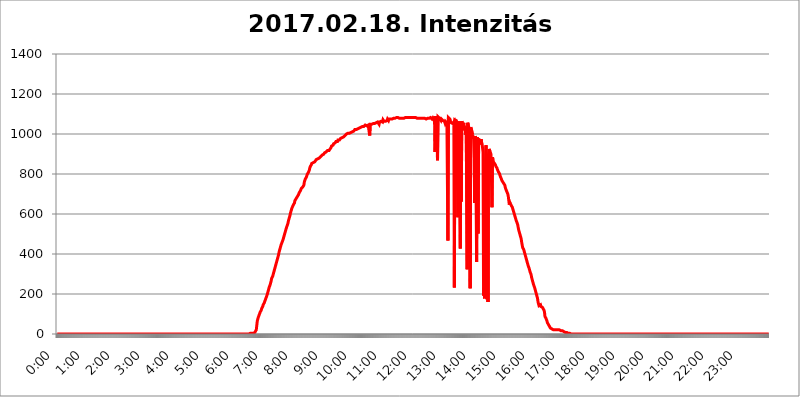
| Category | 2017.02.18. Intenzitás [W/m^2] |
|---|---|
| 0.0 | 0 |
| 0.0006944444444444445 | 0 |
| 0.001388888888888889 | 0 |
| 0.0020833333333333333 | 0 |
| 0.002777777777777778 | 0 |
| 0.003472222222222222 | 0 |
| 0.004166666666666667 | 0 |
| 0.004861111111111111 | 0 |
| 0.005555555555555556 | 0 |
| 0.0062499999999999995 | 0 |
| 0.006944444444444444 | 0 |
| 0.007638888888888889 | 0 |
| 0.008333333333333333 | 0 |
| 0.009027777777777779 | 0 |
| 0.009722222222222222 | 0 |
| 0.010416666666666666 | 0 |
| 0.011111111111111112 | 0 |
| 0.011805555555555555 | 0 |
| 0.012499999999999999 | 0 |
| 0.013194444444444444 | 0 |
| 0.013888888888888888 | 0 |
| 0.014583333333333332 | 0 |
| 0.015277777777777777 | 0 |
| 0.015972222222222224 | 0 |
| 0.016666666666666666 | 0 |
| 0.017361111111111112 | 0 |
| 0.018055555555555557 | 0 |
| 0.01875 | 0 |
| 0.019444444444444445 | 0 |
| 0.02013888888888889 | 0 |
| 0.020833333333333332 | 0 |
| 0.02152777777777778 | 0 |
| 0.022222222222222223 | 0 |
| 0.02291666666666667 | 0 |
| 0.02361111111111111 | 0 |
| 0.024305555555555556 | 0 |
| 0.024999999999999998 | 0 |
| 0.025694444444444447 | 0 |
| 0.02638888888888889 | 0 |
| 0.027083333333333334 | 0 |
| 0.027777777777777776 | 0 |
| 0.02847222222222222 | 0 |
| 0.029166666666666664 | 0 |
| 0.029861111111111113 | 0 |
| 0.030555555555555555 | 0 |
| 0.03125 | 0 |
| 0.03194444444444445 | 0 |
| 0.03263888888888889 | 0 |
| 0.03333333333333333 | 0 |
| 0.034027777777777775 | 0 |
| 0.034722222222222224 | 0 |
| 0.035416666666666666 | 0 |
| 0.036111111111111115 | 0 |
| 0.03680555555555556 | 0 |
| 0.0375 | 0 |
| 0.03819444444444444 | 0 |
| 0.03888888888888889 | 0 |
| 0.03958333333333333 | 0 |
| 0.04027777777777778 | 0 |
| 0.04097222222222222 | 0 |
| 0.041666666666666664 | 0 |
| 0.042361111111111106 | 0 |
| 0.04305555555555556 | 0 |
| 0.043750000000000004 | 0 |
| 0.044444444444444446 | 0 |
| 0.04513888888888889 | 0 |
| 0.04583333333333334 | 0 |
| 0.04652777777777778 | 0 |
| 0.04722222222222222 | 0 |
| 0.04791666666666666 | 0 |
| 0.04861111111111111 | 0 |
| 0.049305555555555554 | 0 |
| 0.049999999999999996 | 0 |
| 0.05069444444444445 | 0 |
| 0.051388888888888894 | 0 |
| 0.052083333333333336 | 0 |
| 0.05277777777777778 | 0 |
| 0.05347222222222222 | 0 |
| 0.05416666666666667 | 0 |
| 0.05486111111111111 | 0 |
| 0.05555555555555555 | 0 |
| 0.05625 | 0 |
| 0.05694444444444444 | 0 |
| 0.057638888888888885 | 0 |
| 0.05833333333333333 | 0 |
| 0.05902777777777778 | 0 |
| 0.059722222222222225 | 0 |
| 0.06041666666666667 | 0 |
| 0.061111111111111116 | 0 |
| 0.06180555555555556 | 0 |
| 0.0625 | 0 |
| 0.06319444444444444 | 0 |
| 0.06388888888888888 | 0 |
| 0.06458333333333334 | 0 |
| 0.06527777777777778 | 0 |
| 0.06597222222222222 | 0 |
| 0.06666666666666667 | 0 |
| 0.06736111111111111 | 0 |
| 0.06805555555555555 | 0 |
| 0.06874999999999999 | 0 |
| 0.06944444444444443 | 0 |
| 0.07013888888888889 | 0 |
| 0.07083333333333333 | 0 |
| 0.07152777777777779 | 0 |
| 0.07222222222222223 | 0 |
| 0.07291666666666667 | 0 |
| 0.07361111111111111 | 0 |
| 0.07430555555555556 | 0 |
| 0.075 | 0 |
| 0.07569444444444444 | 0 |
| 0.0763888888888889 | 0 |
| 0.07708333333333334 | 0 |
| 0.07777777777777778 | 0 |
| 0.07847222222222222 | 0 |
| 0.07916666666666666 | 0 |
| 0.0798611111111111 | 0 |
| 0.08055555555555556 | 0 |
| 0.08125 | 0 |
| 0.08194444444444444 | 0 |
| 0.08263888888888889 | 0 |
| 0.08333333333333333 | 0 |
| 0.08402777777777777 | 0 |
| 0.08472222222222221 | 0 |
| 0.08541666666666665 | 0 |
| 0.08611111111111112 | 0 |
| 0.08680555555555557 | 0 |
| 0.08750000000000001 | 0 |
| 0.08819444444444445 | 0 |
| 0.08888888888888889 | 0 |
| 0.08958333333333333 | 0 |
| 0.09027777777777778 | 0 |
| 0.09097222222222222 | 0 |
| 0.09166666666666667 | 0 |
| 0.09236111111111112 | 0 |
| 0.09305555555555556 | 0 |
| 0.09375 | 0 |
| 0.09444444444444444 | 0 |
| 0.09513888888888888 | 0 |
| 0.09583333333333333 | 0 |
| 0.09652777777777777 | 0 |
| 0.09722222222222222 | 0 |
| 0.09791666666666667 | 0 |
| 0.09861111111111111 | 0 |
| 0.09930555555555555 | 0 |
| 0.09999999999999999 | 0 |
| 0.10069444444444443 | 0 |
| 0.1013888888888889 | 0 |
| 0.10208333333333335 | 0 |
| 0.10277777777777779 | 0 |
| 0.10347222222222223 | 0 |
| 0.10416666666666667 | 0 |
| 0.10486111111111111 | 0 |
| 0.10555555555555556 | 0 |
| 0.10625 | 0 |
| 0.10694444444444444 | 0 |
| 0.1076388888888889 | 0 |
| 0.10833333333333334 | 0 |
| 0.10902777777777778 | 0 |
| 0.10972222222222222 | 0 |
| 0.1111111111111111 | 0 |
| 0.11180555555555556 | 0 |
| 0.11180555555555556 | 0 |
| 0.1125 | 0 |
| 0.11319444444444444 | 0 |
| 0.11388888888888889 | 0 |
| 0.11458333333333333 | 0 |
| 0.11527777777777777 | 0 |
| 0.11597222222222221 | 0 |
| 0.11666666666666665 | 0 |
| 0.1173611111111111 | 0 |
| 0.11805555555555557 | 0 |
| 0.11944444444444445 | 0 |
| 0.12013888888888889 | 0 |
| 0.12083333333333333 | 0 |
| 0.12152777777777778 | 0 |
| 0.12222222222222223 | 0 |
| 0.12291666666666667 | 0 |
| 0.12291666666666667 | 0 |
| 0.12361111111111112 | 0 |
| 0.12430555555555556 | 0 |
| 0.125 | 0 |
| 0.12569444444444444 | 0 |
| 0.12638888888888888 | 0 |
| 0.12708333333333333 | 0 |
| 0.16875 | 0 |
| 0.12847222222222224 | 0 |
| 0.12916666666666668 | 0 |
| 0.12986111111111112 | 0 |
| 0.13055555555555556 | 0 |
| 0.13125 | 0 |
| 0.13194444444444445 | 0 |
| 0.1326388888888889 | 0 |
| 0.13333333333333333 | 0 |
| 0.13402777777777777 | 0 |
| 0.13402777777777777 | 0 |
| 0.13472222222222222 | 0 |
| 0.13541666666666666 | 0 |
| 0.1361111111111111 | 0 |
| 0.13749999999999998 | 0 |
| 0.13819444444444443 | 0 |
| 0.1388888888888889 | 0 |
| 0.13958333333333334 | 0 |
| 0.14027777777777778 | 0 |
| 0.14097222222222222 | 0 |
| 0.14166666666666666 | 0 |
| 0.1423611111111111 | 0 |
| 0.14305555555555557 | 0 |
| 0.14375000000000002 | 0 |
| 0.14444444444444446 | 0 |
| 0.1451388888888889 | 0 |
| 0.1451388888888889 | 0 |
| 0.14652777777777778 | 0 |
| 0.14722222222222223 | 0 |
| 0.14791666666666667 | 0 |
| 0.1486111111111111 | 0 |
| 0.14930555555555555 | 0 |
| 0.15 | 0 |
| 0.15069444444444444 | 0 |
| 0.15138888888888888 | 0 |
| 0.15208333333333332 | 0 |
| 0.15277777777777776 | 0 |
| 0.15347222222222223 | 0 |
| 0.15416666666666667 | 0 |
| 0.15486111111111112 | 0 |
| 0.15555555555555556 | 0 |
| 0.15625 | 0 |
| 0.15694444444444444 | 0 |
| 0.15763888888888888 | 0 |
| 0.15833333333333333 | 0 |
| 0.15902777777777777 | 0 |
| 0.15972222222222224 | 0 |
| 0.16041666666666668 | 0 |
| 0.16111111111111112 | 0 |
| 0.16180555555555556 | 0 |
| 0.1625 | 0 |
| 0.16319444444444445 | 0 |
| 0.1638888888888889 | 0 |
| 0.16458333333333333 | 0 |
| 0.16527777777777777 | 0 |
| 0.16597222222222222 | 0 |
| 0.16666666666666666 | 0 |
| 0.1673611111111111 | 0 |
| 0.16805555555555554 | 0 |
| 0.16874999999999998 | 0 |
| 0.16944444444444443 | 0 |
| 0.17013888888888887 | 0 |
| 0.1708333333333333 | 0 |
| 0.17152777777777775 | 0 |
| 0.17222222222222225 | 0 |
| 0.1729166666666667 | 0 |
| 0.17361111111111113 | 0 |
| 0.17430555555555557 | 0 |
| 0.17500000000000002 | 0 |
| 0.17569444444444446 | 0 |
| 0.1763888888888889 | 0 |
| 0.17708333333333334 | 0 |
| 0.17777777777777778 | 0 |
| 0.17847222222222223 | 0 |
| 0.17916666666666667 | 0 |
| 0.1798611111111111 | 0 |
| 0.18055555555555555 | 0 |
| 0.18125 | 0 |
| 0.18194444444444444 | 0 |
| 0.1826388888888889 | 0 |
| 0.18333333333333335 | 0 |
| 0.1840277777777778 | 0 |
| 0.18472222222222223 | 0 |
| 0.18541666666666667 | 0 |
| 0.18611111111111112 | 0 |
| 0.18680555555555556 | 0 |
| 0.1875 | 0 |
| 0.18819444444444444 | 0 |
| 0.18888888888888888 | 0 |
| 0.18958333333333333 | 0 |
| 0.19027777777777777 | 0 |
| 0.1909722222222222 | 0 |
| 0.19166666666666665 | 0 |
| 0.19236111111111112 | 0 |
| 0.19305555555555554 | 0 |
| 0.19375 | 0 |
| 0.19444444444444445 | 0 |
| 0.1951388888888889 | 0 |
| 0.19583333333333333 | 0 |
| 0.19652777777777777 | 0 |
| 0.19722222222222222 | 0 |
| 0.19791666666666666 | 0 |
| 0.1986111111111111 | 0 |
| 0.19930555555555554 | 0 |
| 0.19999999999999998 | 0 |
| 0.20069444444444443 | 0 |
| 0.20138888888888887 | 0 |
| 0.2020833333333333 | 0 |
| 0.2027777777777778 | 0 |
| 0.2034722222222222 | 0 |
| 0.2041666666666667 | 0 |
| 0.20486111111111113 | 0 |
| 0.20555555555555557 | 0 |
| 0.20625000000000002 | 0 |
| 0.20694444444444446 | 0 |
| 0.2076388888888889 | 0 |
| 0.20833333333333334 | 0 |
| 0.20902777777777778 | 0 |
| 0.20972222222222223 | 0 |
| 0.21041666666666667 | 0 |
| 0.2111111111111111 | 0 |
| 0.21180555555555555 | 0 |
| 0.2125 | 0 |
| 0.21319444444444444 | 0 |
| 0.2138888888888889 | 0 |
| 0.21458333333333335 | 0 |
| 0.2152777777777778 | 0 |
| 0.21597222222222223 | 0 |
| 0.21666666666666667 | 0 |
| 0.21736111111111112 | 0 |
| 0.21805555555555556 | 0 |
| 0.21875 | 0 |
| 0.21944444444444444 | 0 |
| 0.22013888888888888 | 0 |
| 0.22083333333333333 | 0 |
| 0.22152777777777777 | 0 |
| 0.2222222222222222 | 0 |
| 0.22291666666666665 | 0 |
| 0.2236111111111111 | 0 |
| 0.22430555555555556 | 0 |
| 0.225 | 0 |
| 0.22569444444444445 | 0 |
| 0.2263888888888889 | 0 |
| 0.22708333333333333 | 0 |
| 0.22777777777777777 | 0 |
| 0.22847222222222222 | 0 |
| 0.22916666666666666 | 0 |
| 0.2298611111111111 | 0 |
| 0.23055555555555554 | 0 |
| 0.23124999999999998 | 0 |
| 0.23194444444444443 | 0 |
| 0.23263888888888887 | 0 |
| 0.2333333333333333 | 0 |
| 0.2340277777777778 | 0 |
| 0.2347222222222222 | 0 |
| 0.2354166666666667 | 0 |
| 0.23611111111111113 | 0 |
| 0.23680555555555557 | 0 |
| 0.23750000000000002 | 0 |
| 0.23819444444444446 | 0 |
| 0.2388888888888889 | 0 |
| 0.23958333333333334 | 0 |
| 0.24027777777777778 | 0 |
| 0.24097222222222223 | 0 |
| 0.24166666666666667 | 0 |
| 0.2423611111111111 | 0 |
| 0.24305555555555555 | 0 |
| 0.24375 | 0 |
| 0.24444444444444446 | 0 |
| 0.24513888888888888 | 0 |
| 0.24583333333333335 | 0 |
| 0.2465277777777778 | 0 |
| 0.24722222222222223 | 0 |
| 0.24791666666666667 | 0 |
| 0.24861111111111112 | 0 |
| 0.24930555555555556 | 0 |
| 0.25 | 0 |
| 0.25069444444444444 | 0 |
| 0.2513888888888889 | 0 |
| 0.2520833333333333 | 0 |
| 0.25277777777777777 | 0 |
| 0.2534722222222222 | 0 |
| 0.25416666666666665 | 0 |
| 0.2548611111111111 | 0 |
| 0.2555555555555556 | 0 |
| 0.25625000000000003 | 0 |
| 0.2569444444444445 | 0 |
| 0.2576388888888889 | 0 |
| 0.25833333333333336 | 0 |
| 0.2590277777777778 | 0 |
| 0.25972222222222224 | 0 |
| 0.2604166666666667 | 0 |
| 0.2611111111111111 | 0 |
| 0.26180555555555557 | 0 |
| 0.2625 | 0 |
| 0.26319444444444445 | 0 |
| 0.2638888888888889 | 0 |
| 0.26458333333333334 | 0 |
| 0.2652777777777778 | 0 |
| 0.2659722222222222 | 0 |
| 0.26666666666666666 | 0 |
| 0.2673611111111111 | 0 |
| 0.26805555555555555 | 0 |
| 0.26875 | 0 |
| 0.26944444444444443 | 3.525 |
| 0.2701388888888889 | 3.525 |
| 0.2708333333333333 | 3.525 |
| 0.27152777777777776 | 3.525 |
| 0.2722222222222222 | 3.525 |
| 0.27291666666666664 | 3.525 |
| 0.2736111111111111 | 3.525 |
| 0.2743055555555555 | 3.525 |
| 0.27499999999999997 | 3.525 |
| 0.27569444444444446 | 7.887 |
| 0.27638888888888885 | 7.887 |
| 0.27708333333333335 | 7.887 |
| 0.2777777777777778 | 12.257 |
| 0.27847222222222223 | 12.257 |
| 0.2791666666666667 | 21.024 |
| 0.2798611111111111 | 43.079 |
| 0.28055555555555556 | 65.31 |
| 0.28125 | 74.246 |
| 0.28194444444444444 | 83.205 |
| 0.2826388888888889 | 87.692 |
| 0.2833333333333333 | 96.682 |
| 0.28402777777777777 | 101.184 |
| 0.2847222222222222 | 110.201 |
| 0.28541666666666665 | 114.716 |
| 0.28611111111111115 | 119.235 |
| 0.28680555555555554 | 128.284 |
| 0.28750000000000003 | 132.814 |
| 0.2881944444444445 | 137.347 |
| 0.2888888888888889 | 146.423 |
| 0.28958333333333336 | 150.964 |
| 0.2902777777777778 | 155.509 |
| 0.29097222222222224 | 160.056 |
| 0.2916666666666667 | 169.156 |
| 0.2923611111111111 | 173.709 |
| 0.29305555555555557 | 182.82 |
| 0.29375 | 187.378 |
| 0.29444444444444445 | 196.497 |
| 0.2951388888888889 | 205.62 |
| 0.29583333333333334 | 214.746 |
| 0.2965277777777778 | 223.873 |
| 0.2972222222222222 | 233 |
| 0.29791666666666666 | 237.564 |
| 0.2986111111111111 | 246.689 |
| 0.29930555555555555 | 255.813 |
| 0.3 | 264.932 |
| 0.30069444444444443 | 278.603 |
| 0.3013888888888889 | 283.156 |
| 0.3020833333333333 | 287.709 |
| 0.30277777777777776 | 296.808 |
| 0.3034722222222222 | 305.898 |
| 0.30416666666666664 | 314.98 |
| 0.3048611111111111 | 319.517 |
| 0.3055555555555555 | 333.113 |
| 0.30624999999999997 | 342.162 |
| 0.3069444444444444 | 351.198 |
| 0.3076388888888889 | 360.221 |
| 0.30833333333333335 | 360.221 |
| 0.3090277777777778 | 378.224 |
| 0.30972222222222223 | 387.202 |
| 0.3104166666666667 | 396.164 |
| 0.3111111111111111 | 409.574 |
| 0.31180555555555556 | 418.492 |
| 0.3125 | 427.39 |
| 0.31319444444444444 | 436.27 |
| 0.3138888888888889 | 445.129 |
| 0.3145833333333333 | 449.551 |
| 0.31527777777777777 | 458.38 |
| 0.3159722222222222 | 462.786 |
| 0.31666666666666665 | 471.582 |
| 0.31736111111111115 | 480.356 |
| 0.31805555555555554 | 489.108 |
| 0.31875000000000003 | 497.836 |
| 0.3194444444444445 | 506.542 |
| 0.3201388888888889 | 515.223 |
| 0.32083333333333336 | 523.88 |
| 0.3215277777777778 | 532.513 |
| 0.32222222222222224 | 536.82 |
| 0.3229166666666667 | 536.82 |
| 0.3236111111111111 | 553.986 |
| 0.32430555555555557 | 566.793 |
| 0.325 | 575.299 |
| 0.32569444444444445 | 583.779 |
| 0.3263888888888889 | 592.233 |
| 0.32708333333333334 | 604.864 |
| 0.3277777777777778 | 613.252 |
| 0.3284722222222222 | 621.613 |
| 0.32916666666666666 | 629.948 |
| 0.3298611111111111 | 634.105 |
| 0.33055555555555555 | 634.105 |
| 0.33125 | 646.537 |
| 0.33194444444444443 | 650.667 |
| 0.3326388888888889 | 654.791 |
| 0.3333333333333333 | 667.123 |
| 0.3340277777777778 | 671.22 |
| 0.3347222222222222 | 671.22 |
| 0.3354166666666667 | 679.395 |
| 0.3361111111111111 | 683.473 |
| 0.3368055555555556 | 687.544 |
| 0.33749999999999997 | 687.544 |
| 0.33819444444444446 | 695.666 |
| 0.33888888888888885 | 695.666 |
| 0.33958333333333335 | 707.8 |
| 0.34027777777777773 | 711.832 |
| 0.34097222222222223 | 715.858 |
| 0.3416666666666666 | 719.877 |
| 0.3423611111111111 | 727.896 |
| 0.3430555555555555 | 727.896 |
| 0.34375 | 731.896 |
| 0.3444444444444445 | 735.89 |
| 0.3451388888888889 | 739.877 |
| 0.3458333333333334 | 743.859 |
| 0.34652777777777777 | 759.723 |
| 0.34722222222222227 | 759.723 |
| 0.34791666666666665 | 775.492 |
| 0.34861111111111115 | 779.42 |
| 0.34930555555555554 | 783.342 |
| 0.35000000000000003 | 791.169 |
| 0.3506944444444444 | 798.974 |
| 0.3513888888888889 | 802.868 |
| 0.3520833333333333 | 806.757 |
| 0.3527777777777778 | 810.641 |
| 0.3534722222222222 | 818.392 |
| 0.3541666666666667 | 829.981 |
| 0.3548611111111111 | 837.682 |
| 0.35555555555555557 | 841.526 |
| 0.35625 | 845.365 |
| 0.35694444444444445 | 853.029 |
| 0.3576388888888889 | 849.199 |
| 0.35833333333333334 | 853.029 |
| 0.3590277777777778 | 856.855 |
| 0.3597222222222222 | 860.676 |
| 0.36041666666666666 | 860.676 |
| 0.3611111111111111 | 860.676 |
| 0.36180555555555555 | 860.676 |
| 0.3625 | 860.676 |
| 0.36319444444444443 | 872.114 |
| 0.3638888888888889 | 872.114 |
| 0.3645833333333333 | 872.114 |
| 0.3652777777777778 | 875.918 |
| 0.3659722222222222 | 875.918 |
| 0.3666666666666667 | 875.918 |
| 0.3673611111111111 | 879.719 |
| 0.3680555555555556 | 883.516 |
| 0.36874999999999997 | 883.516 |
| 0.36944444444444446 | 887.309 |
| 0.37013888888888885 | 887.309 |
| 0.37083333333333335 | 891.099 |
| 0.37152777777777773 | 894.885 |
| 0.37222222222222223 | 898.668 |
| 0.3729166666666666 | 894.885 |
| 0.3736111111111111 | 898.668 |
| 0.3743055555555555 | 902.447 |
| 0.375 | 906.223 |
| 0.3756944444444445 | 906.223 |
| 0.3763888888888889 | 909.996 |
| 0.3770833333333334 | 909.996 |
| 0.37777777777777777 | 909.996 |
| 0.37847222222222227 | 909.996 |
| 0.37916666666666665 | 917.534 |
| 0.37986111111111115 | 917.534 |
| 0.38055555555555554 | 917.534 |
| 0.38125000000000003 | 917.534 |
| 0.3819444444444444 | 921.298 |
| 0.3826388888888889 | 925.06 |
| 0.3833333333333333 | 928.819 |
| 0.3840277777777778 | 932.576 |
| 0.3847222222222222 | 940.082 |
| 0.3854166666666667 | 940.082 |
| 0.3861111111111111 | 943.832 |
| 0.38680555555555557 | 943.832 |
| 0.3875 | 951.327 |
| 0.38819444444444445 | 955.071 |
| 0.3888888888888889 | 955.071 |
| 0.38958333333333334 | 955.071 |
| 0.3902777777777778 | 955.071 |
| 0.3909722222222222 | 962.555 |
| 0.39166666666666666 | 962.555 |
| 0.3923611111111111 | 958.814 |
| 0.39305555555555555 | 962.555 |
| 0.39375 | 970.034 |
| 0.39444444444444443 | 970.034 |
| 0.3951388888888889 | 970.034 |
| 0.3958333333333333 | 970.034 |
| 0.3965277777777778 | 973.772 |
| 0.3972222222222222 | 977.508 |
| 0.3979166666666667 | 977.508 |
| 0.3986111111111111 | 977.508 |
| 0.3993055555555556 | 981.244 |
| 0.39999999999999997 | 984.98 |
| 0.40069444444444446 | 984.98 |
| 0.40138888888888885 | 984.98 |
| 0.40208333333333335 | 988.714 |
| 0.40277777777777773 | 988.714 |
| 0.40347222222222223 | 992.448 |
| 0.4041666666666666 | 992.448 |
| 0.4048611111111111 | 996.182 |
| 0.4055555555555555 | 999.916 |
| 0.40625 | 996.182 |
| 0.4069444444444445 | 999.916 |
| 0.4076388888888889 | 1003.65 |
| 0.4083333333333334 | 1003.65 |
| 0.40902777777777777 | 999.916 |
| 0.40972222222222227 | 1003.65 |
| 0.41041666666666665 | 1007.383 |
| 0.41111111111111115 | 1007.383 |
| 0.41180555555555554 | 1007.383 |
| 0.41250000000000003 | 1007.383 |
| 0.4131944444444444 | 1011.118 |
| 0.4138888888888889 | 1011.118 |
| 0.4145833333333333 | 1014.852 |
| 0.4152777777777778 | 1014.852 |
| 0.4159722222222222 | 1014.852 |
| 0.4166666666666667 | 1018.587 |
| 0.4173611111111111 | 1022.323 |
| 0.41805555555555557 | 1022.323 |
| 0.41875 | 1022.323 |
| 0.41944444444444445 | 1022.323 |
| 0.4201388888888889 | 1026.06 |
| 0.42083333333333334 | 1026.06 |
| 0.4215277777777778 | 1026.06 |
| 0.4222222222222222 | 1029.798 |
| 0.42291666666666666 | 1029.798 |
| 0.4236111111111111 | 1029.798 |
| 0.42430555555555555 | 1033.537 |
| 0.425 | 1033.537 |
| 0.42569444444444443 | 1033.537 |
| 0.4263888888888889 | 1037.277 |
| 0.4270833333333333 | 1037.277 |
| 0.4277777777777778 | 1037.277 |
| 0.4284722222222222 | 1037.277 |
| 0.4291666666666667 | 1037.277 |
| 0.4298611111111111 | 1037.277 |
| 0.4305555555555556 | 1037.277 |
| 0.43124999999999997 | 1041.019 |
| 0.43194444444444446 | 1044.762 |
| 0.43263888888888885 | 1041.019 |
| 0.43333333333333335 | 1044.762 |
| 0.43402777777777773 | 1041.019 |
| 0.43472222222222223 | 1041.019 |
| 0.4354166666666666 | 1044.762 |
| 0.4361111111111111 | 1044.762 |
| 0.4368055555555555 | 1048.508 |
| 0.4375 | 1044.762 |
| 0.4381944444444445 | 992.448 |
| 0.4388888888888889 | 1048.508 |
| 0.4395833333333334 | 1048.508 |
| 0.44027777777777777 | 1052.255 |
| 0.44097222222222227 | 1048.508 |
| 0.44166666666666665 | 1052.255 |
| 0.44236111111111115 | 1052.255 |
| 0.44305555555555554 | 1052.255 |
| 0.44375000000000003 | 1052.255 |
| 0.4444444444444444 | 1056.004 |
| 0.4451388888888889 | 1052.255 |
| 0.4458333333333333 | 1056.004 |
| 0.4465277777777778 | 1056.004 |
| 0.4472222222222222 | 1056.004 |
| 0.4479166666666667 | 1059.756 |
| 0.4486111111111111 | 1059.756 |
| 0.44930555555555557 | 1059.756 |
| 0.45 | 1063.51 |
| 0.45069444444444445 | 1063.51 |
| 0.4513888888888889 | 1048.508 |
| 0.45208333333333334 | 1059.756 |
| 0.4527777777777778 | 1063.51 |
| 0.4534722222222222 | 1063.51 |
| 0.45416666666666666 | 1063.51 |
| 0.4548611111111111 | 1067.267 |
| 0.45555555555555555 | 1067.267 |
| 0.45625 | 1059.756 |
| 0.45694444444444443 | 1071.027 |
| 0.4576388888888889 | 1067.267 |
| 0.4583333333333333 | 1063.51 |
| 0.4590277777777778 | 1067.267 |
| 0.4597222222222222 | 1067.267 |
| 0.4604166666666667 | 1063.51 |
| 0.4611111111111111 | 1067.267 |
| 0.4618055555555556 | 1063.51 |
| 0.46249999999999997 | 1067.267 |
| 0.46319444444444446 | 1074.789 |
| 0.46388888888888885 | 1074.789 |
| 0.46458333333333335 | 1067.267 |
| 0.46527777777777773 | 1074.789 |
| 0.46597222222222223 | 1074.789 |
| 0.4666666666666666 | 1074.789 |
| 0.4673611111111111 | 1074.789 |
| 0.4680555555555555 | 1074.789 |
| 0.46875 | 1074.789 |
| 0.4694444444444445 | 1074.789 |
| 0.4701388888888889 | 1074.789 |
| 0.4708333333333334 | 1074.789 |
| 0.47152777777777777 | 1078.555 |
| 0.47222222222222227 | 1078.555 |
| 0.47291666666666665 | 1078.555 |
| 0.47361111111111115 | 1078.555 |
| 0.47430555555555554 | 1078.555 |
| 0.47500000000000003 | 1078.555 |
| 0.4756944444444444 | 1082.324 |
| 0.4763888888888889 | 1078.555 |
| 0.4770833333333333 | 1078.555 |
| 0.4777777777777778 | 1082.324 |
| 0.4784722222222222 | 1082.324 |
| 0.4791666666666667 | 1078.555 |
| 0.4798611111111111 | 1078.555 |
| 0.48055555555555557 | 1078.555 |
| 0.48125 | 1078.555 |
| 0.48194444444444445 | 1078.555 |
| 0.4826388888888889 | 1078.555 |
| 0.48333333333333334 | 1078.555 |
| 0.4840277777777778 | 1078.555 |
| 0.4847222222222222 | 1078.555 |
| 0.48541666666666666 | 1078.555 |
| 0.4861111111111111 | 1078.555 |
| 0.48680555555555555 | 1082.324 |
| 0.4875 | 1082.324 |
| 0.48819444444444443 | 1082.324 |
| 0.4888888888888889 | 1082.324 |
| 0.4895833333333333 | 1082.324 |
| 0.4902777777777778 | 1082.324 |
| 0.4909722222222222 | 1082.324 |
| 0.4916666666666667 | 1082.324 |
| 0.4923611111111111 | 1082.324 |
| 0.4930555555555556 | 1082.324 |
| 0.49374999999999997 | 1082.324 |
| 0.49444444444444446 | 1082.324 |
| 0.49513888888888885 | 1082.324 |
| 0.49583333333333335 | 1082.324 |
| 0.49652777777777773 | 1082.324 |
| 0.49722222222222223 | 1082.324 |
| 0.4979166666666666 | 1082.324 |
| 0.4986111111111111 | 1082.324 |
| 0.4993055555555555 | 1082.324 |
| 0.5 | 1082.324 |
| 0.5006944444444444 | 1082.324 |
| 0.5013888888888889 | 1082.324 |
| 0.5020833333333333 | 1082.324 |
| 0.5027777777777778 | 1082.324 |
| 0.5034722222222222 | 1082.324 |
| 0.5041666666666667 | 1082.324 |
| 0.5048611111111111 | 1078.555 |
| 0.5055555555555555 | 1078.555 |
| 0.50625 | 1082.324 |
| 0.5069444444444444 | 1078.555 |
| 0.5076388888888889 | 1078.555 |
| 0.5083333333333333 | 1078.555 |
| 0.5090277777777777 | 1078.555 |
| 0.5097222222222222 | 1074.789 |
| 0.5104166666666666 | 1074.789 |
| 0.5111111111111112 | 1078.555 |
| 0.5118055555555555 | 1074.789 |
| 0.5125000000000001 | 1078.555 |
| 0.5131944444444444 | 1078.555 |
| 0.513888888888889 | 1074.789 |
| 0.5145833333333333 | 1082.324 |
| 0.5152777777777778 | 1078.555 |
| 0.5159722222222222 | 1078.555 |
| 0.5166666666666667 | 1078.555 |
| 0.517361111111111 | 1074.789 |
| 0.5180555555555556 | 1074.789 |
| 0.5187499999999999 | 1074.789 |
| 0.5194444444444445 | 1078.555 |
| 0.5201388888888888 | 1074.789 |
| 0.5208333333333334 | 1074.789 |
| 0.5215277777777778 | 1078.555 |
| 0.5222222222222223 | 1082.324 |
| 0.5229166666666667 | 1082.324 |
| 0.5236111111111111 | 1082.324 |
| 0.5243055555555556 | 1078.555 |
| 0.525 | 1078.555 |
| 0.5256944444444445 | 1074.789 |
| 0.5263888888888889 | 1078.555 |
| 0.5270833333333333 | 1082.324 |
| 0.5277777777777778 | 1082.324 |
| 0.5284722222222222 | 1082.324 |
| 0.5291666666666667 | 1074.789 |
| 0.5298611111111111 | 909.996 |
| 0.5305555555555556 | 1089.873 |
| 0.53125 | 1086.097 |
| 0.5319444444444444 | 981.244 |
| 0.5326388888888889 | 1086.097 |
| 0.5333333333333333 | 868.305 |
| 0.5340277777777778 | 1086.097 |
| 0.5347222222222222 | 1086.097 |
| 0.5354166666666667 | 1086.097 |
| 0.5361111111111111 | 1078.555 |
| 0.5368055555555555 | 1078.555 |
| 0.5375 | 1074.789 |
| 0.5381944444444444 | 1067.267 |
| 0.5388888888888889 | 1074.789 |
| 0.5395833333333333 | 1074.789 |
| 0.5402777777777777 | 1071.027 |
| 0.5409722222222222 | 1067.267 |
| 0.5416666666666666 | 1067.267 |
| 0.5423611111111112 | 1067.267 |
| 0.5430555555555555 | 1063.51 |
| 0.5437500000000001 | 1056.004 |
| 0.5444444444444444 | 1063.51 |
| 0.545138888888889 | 1059.756 |
| 0.5458333333333333 | 1063.51 |
| 0.5465277777777778 | 1056.004 |
| 0.5472222222222222 | 1052.255 |
| 0.5479166666666667 | 467.187 |
| 0.548611111111111 | 1082.324 |
| 0.5493055555555556 | 1078.555 |
| 0.5499999999999999 | 1082.324 |
| 0.5506944444444445 | 1074.789 |
| 0.5513888888888888 | 1067.267 |
| 0.5520833333333334 | 1063.51 |
| 0.5527777777777778 | 1056.004 |
| 0.5534722222222223 | 1052.255 |
| 0.5541666666666667 | 1052.255 |
| 0.5548611111111111 | 1052.255 |
| 0.5555555555555556 | 1048.508 |
| 0.55625 | 1059.756 |
| 0.5569444444444445 | 233 |
| 0.5576388888888889 | 1071.027 |
| 0.5583333333333333 | 1074.789 |
| 0.5590277777777778 | 1071.027 |
| 0.5597222222222222 | 1067.267 |
| 0.5604166666666667 | 1059.756 |
| 0.5611111111111111 | 1052.255 |
| 0.5618055555555556 | 583.779 |
| 0.5625 | 1044.762 |
| 0.5631944444444444 | 1048.508 |
| 0.5638888888888889 | 1063.51 |
| 0.5645833333333333 | 621.613 |
| 0.5652777777777778 | 427.39 |
| 0.5659722222222222 | 1056.004 |
| 0.5666666666666667 | 663.019 |
| 0.5673611111111111 | 1063.51 |
| 0.5680555555555555 | 1056.004 |
| 0.56875 | 1052.255 |
| 0.5694444444444444 | 1041.019 |
| 0.5701388888888889 | 1056.004 |
| 0.5708333333333333 | 1018.587 |
| 0.5715277777777777 | 1037.277 |
| 0.5722222222222222 | 1029.798 |
| 0.5729166666666666 | 996.182 |
| 0.5736111111111112 | 1033.537 |
| 0.5743055555555555 | 1037.277 |
| 0.5750000000000001 | 324.052 |
| 0.5756944444444444 | 1056.004 |
| 0.576388888888889 | 1044.762 |
| 0.5770833333333333 | 1037.277 |
| 0.5777777777777778 | 378.224 |
| 0.5784722222222222 | 1018.587 |
| 0.5791666666666667 | 228.436 |
| 0.579861111111111 | 1033.537 |
| 0.5805555555555556 | 1029.798 |
| 0.5812499999999999 | 1018.587 |
| 0.5819444444444445 | 1011.118 |
| 0.5826388888888888 | 996.182 |
| 0.5833333333333334 | 992.448 |
| 0.5840277777777778 | 973.772 |
| 0.5847222222222223 | 891.099 |
| 0.5854166666666667 | 654.791 |
| 0.5861111111111111 | 988.714 |
| 0.5868055555555556 | 981.244 |
| 0.5875 | 984.98 |
| 0.5881944444444445 | 360.221 |
| 0.5888888888888889 | 984.98 |
| 0.5895833333333333 | 755.766 |
| 0.5902777777777778 | 502.192 |
| 0.5909722222222222 | 977.508 |
| 0.5916666666666667 | 955.071 |
| 0.5923611111111111 | 966.295 |
| 0.5930555555555556 | 955.071 |
| 0.59375 | 947.58 |
| 0.5944444444444444 | 973.772 |
| 0.5951388888888889 | 958.814 |
| 0.5958333333333333 | 951.327 |
| 0.5965277777777778 | 951.327 |
| 0.5972222222222222 | 909.996 |
| 0.5979166666666667 | 191.937 |
| 0.5986111111111111 | 233 |
| 0.5993055555555555 | 178.264 |
| 0.6 | 296.808 |
| 0.6006944444444444 | 875.918 |
| 0.6013888888888889 | 943.832 |
| 0.6020833333333333 | 462.786 |
| 0.6027777777777777 | 173.709 |
| 0.6034722222222222 | 798.974 |
| 0.6041666666666666 | 160.056 |
| 0.6048611111111112 | 898.668 |
| 0.6055555555555555 | 925.06 |
| 0.6062500000000001 | 921.298 |
| 0.6069444444444444 | 913.766 |
| 0.607638888888889 | 906.223 |
| 0.6083333333333333 | 898.668 |
| 0.6090277777777778 | 898.668 |
| 0.6097222222222222 | 634.105 |
| 0.6104166666666667 | 883.516 |
| 0.611111111111111 | 872.114 |
| 0.6118055555555556 | 860.676 |
| 0.6124999999999999 | 856.855 |
| 0.6131944444444445 | 853.029 |
| 0.6138888888888888 | 849.199 |
| 0.6145833333333334 | 845.365 |
| 0.6152777777777778 | 837.682 |
| 0.6159722222222223 | 837.682 |
| 0.6166666666666667 | 829.981 |
| 0.6173611111111111 | 822.26 |
| 0.6180555555555556 | 818.392 |
| 0.61875 | 810.641 |
| 0.6194444444444445 | 806.757 |
| 0.6201388888888889 | 802.868 |
| 0.6208333333333333 | 795.074 |
| 0.6215277777777778 | 787.258 |
| 0.6222222222222222 | 783.342 |
| 0.6229166666666667 | 775.492 |
| 0.6236111111111111 | 767.62 |
| 0.6243055555555556 | 763.674 |
| 0.625 | 759.723 |
| 0.6256944444444444 | 755.766 |
| 0.6263888888888889 | 751.803 |
| 0.6270833333333333 | 747.834 |
| 0.6277777777777778 | 743.859 |
| 0.6284722222222222 | 731.896 |
| 0.6291666666666667 | 723.889 |
| 0.6298611111111111 | 719.877 |
| 0.6305555555555555 | 711.832 |
| 0.63125 | 711.832 |
| 0.6319444444444444 | 699.717 |
| 0.6326388888888889 | 687.544 |
| 0.6333333333333333 | 667.123 |
| 0.6340277777777777 | 646.537 |
| 0.6347222222222222 | 658.909 |
| 0.6354166666666666 | 658.909 |
| 0.6361111111111112 | 658.909 |
| 0.6368055555555555 | 642.4 |
| 0.6375000000000001 | 642.4 |
| 0.6381944444444444 | 634.105 |
| 0.638888888888889 | 629.948 |
| 0.6395833333333333 | 617.436 |
| 0.6402777777777778 | 609.062 |
| 0.6409722222222222 | 604.864 |
| 0.6416666666666667 | 592.233 |
| 0.642361111111111 | 583.779 |
| 0.6430555555555556 | 575.299 |
| 0.6437499999999999 | 566.793 |
| 0.6444444444444445 | 562.53 |
| 0.6451388888888888 | 553.986 |
| 0.6458333333333334 | 545.416 |
| 0.6465277777777778 | 532.513 |
| 0.6472222222222223 | 519.555 |
| 0.6479166666666667 | 510.885 |
| 0.6486111111111111 | 502.192 |
| 0.6493055555555556 | 493.475 |
| 0.65 | 489.108 |
| 0.6506944444444445 | 475.972 |
| 0.6513888888888889 | 458.38 |
| 0.6520833333333333 | 458.38 |
| 0.6527777777777778 | 431.833 |
| 0.6534722222222222 | 436.27 |
| 0.6541666666666667 | 422.943 |
| 0.6548611111111111 | 418.492 |
| 0.6555555555555556 | 405.108 |
| 0.65625 | 396.164 |
| 0.6569444444444444 | 387.202 |
| 0.6576388888888889 | 382.715 |
| 0.6583333333333333 | 369.23 |
| 0.6590277777777778 | 360.221 |
| 0.6597222222222222 | 351.198 |
| 0.6604166666666667 | 342.162 |
| 0.6611111111111111 | 337.639 |
| 0.6618055555555555 | 328.584 |
| 0.6625 | 319.517 |
| 0.6631944444444444 | 310.44 |
| 0.6638888888888889 | 305.898 |
| 0.6645833333333333 | 296.808 |
| 0.6652777777777777 | 283.156 |
| 0.6659722222222222 | 274.047 |
| 0.6666666666666666 | 264.932 |
| 0.6673611111111111 | 255.813 |
| 0.6680555555555556 | 246.689 |
| 0.6687500000000001 | 242.127 |
| 0.6694444444444444 | 233 |
| 0.6701388888888888 | 223.873 |
| 0.6708333333333334 | 214.746 |
| 0.6715277777777778 | 205.62 |
| 0.6722222222222222 | 196.497 |
| 0.6729166666666666 | 187.378 |
| 0.6736111111111112 | 178.264 |
| 0.6743055555555556 | 160.056 |
| 0.6749999999999999 | 150.964 |
| 0.6756944444444444 | 141.884 |
| 0.6763888888888889 | 141.884 |
| 0.6770833333333334 | 141.884 |
| 0.6777777777777777 | 146.423 |
| 0.6784722222222223 | 137.347 |
| 0.6791666666666667 | 137.347 |
| 0.6798611111111111 | 132.814 |
| 0.6805555555555555 | 132.814 |
| 0.68125 | 132.814 |
| 0.6819444444444445 | 128.284 |
| 0.6826388888888889 | 119.235 |
| 0.6833333333333332 | 110.201 |
| 0.6840277777777778 | 87.692 |
| 0.6847222222222222 | 83.205 |
| 0.6854166666666667 | 78.722 |
| 0.686111111111111 | 74.246 |
| 0.6868055555555556 | 65.31 |
| 0.6875 | 56.398 |
| 0.6881944444444444 | 51.951 |
| 0.688888888888889 | 47.511 |
| 0.6895833333333333 | 43.079 |
| 0.6902777777777778 | 38.653 |
| 0.6909722222222222 | 38.653 |
| 0.6916666666666668 | 29.823 |
| 0.6923611111111111 | 29.823 |
| 0.6930555555555555 | 29.823 |
| 0.69375 | 25.419 |
| 0.6944444444444445 | 25.419 |
| 0.6951388888888889 | 25.419 |
| 0.6958333333333333 | 21.024 |
| 0.6965277777777777 | 21.024 |
| 0.6972222222222223 | 21.024 |
| 0.6979166666666666 | 21.024 |
| 0.6986111111111111 | 21.024 |
| 0.6993055555555556 | 21.024 |
| 0.7000000000000001 | 21.024 |
| 0.7006944444444444 | 21.024 |
| 0.7013888888888888 | 21.024 |
| 0.7020833333333334 | 21.024 |
| 0.7027777777777778 | 21.024 |
| 0.7034722222222222 | 21.024 |
| 0.7041666666666666 | 21.024 |
| 0.7048611111111112 | 21.024 |
| 0.7055555555555556 | 21.024 |
| 0.7062499999999999 | 16.636 |
| 0.7069444444444444 | 16.636 |
| 0.7076388888888889 | 16.636 |
| 0.7083333333333334 | 16.636 |
| 0.7090277777777777 | 12.257 |
| 0.7097222222222223 | 12.257 |
| 0.7104166666666667 | 12.257 |
| 0.7111111111111111 | 12.257 |
| 0.7118055555555555 | 12.257 |
| 0.7125 | 7.887 |
| 0.7131944444444445 | 7.887 |
| 0.7138888888888889 | 7.887 |
| 0.7145833333333332 | 7.887 |
| 0.7152777777777778 | 7.887 |
| 0.7159722222222222 | 7.887 |
| 0.7166666666666667 | 3.525 |
| 0.717361111111111 | 3.525 |
| 0.7180555555555556 | 3.525 |
| 0.71875 | 3.525 |
| 0.7194444444444444 | 3.525 |
| 0.720138888888889 | 3.525 |
| 0.7208333333333333 | 0 |
| 0.7215277777777778 | 0 |
| 0.7222222222222222 | 0 |
| 0.7229166666666668 | 0 |
| 0.7236111111111111 | 0 |
| 0.7243055555555555 | 0 |
| 0.725 | 0 |
| 0.7256944444444445 | 0 |
| 0.7263888888888889 | 0 |
| 0.7270833333333333 | 0 |
| 0.7277777777777777 | 0 |
| 0.7284722222222223 | 0 |
| 0.7291666666666666 | 0 |
| 0.7298611111111111 | 0 |
| 0.7305555555555556 | 0 |
| 0.7312500000000001 | 0 |
| 0.7319444444444444 | 0 |
| 0.7326388888888888 | 0 |
| 0.7333333333333334 | 0 |
| 0.7340277777777778 | 0 |
| 0.7347222222222222 | 0 |
| 0.7354166666666666 | 0 |
| 0.7361111111111112 | 0 |
| 0.7368055555555556 | 0 |
| 0.7374999999999999 | 0 |
| 0.7381944444444444 | 0 |
| 0.7388888888888889 | 0 |
| 0.7395833333333334 | 0 |
| 0.7402777777777777 | 0 |
| 0.7409722222222223 | 0 |
| 0.7416666666666667 | 0 |
| 0.7423611111111111 | 0 |
| 0.7430555555555555 | 0 |
| 0.74375 | 0 |
| 0.7444444444444445 | 0 |
| 0.7451388888888889 | 0 |
| 0.7458333333333332 | 0 |
| 0.7465277777777778 | 0 |
| 0.7472222222222222 | 0 |
| 0.7479166666666667 | 0 |
| 0.748611111111111 | 0 |
| 0.7493055555555556 | 0 |
| 0.75 | 0 |
| 0.7506944444444444 | 0 |
| 0.751388888888889 | 0 |
| 0.7520833333333333 | 0 |
| 0.7527777777777778 | 0 |
| 0.7534722222222222 | 0 |
| 0.7541666666666668 | 0 |
| 0.7548611111111111 | 0 |
| 0.7555555555555555 | 0 |
| 0.75625 | 0 |
| 0.7569444444444445 | 0 |
| 0.7576388888888889 | 0 |
| 0.7583333333333333 | 0 |
| 0.7590277777777777 | 0 |
| 0.7597222222222223 | 0 |
| 0.7604166666666666 | 0 |
| 0.7611111111111111 | 0 |
| 0.7618055555555556 | 0 |
| 0.7625000000000001 | 0 |
| 0.7631944444444444 | 0 |
| 0.7638888888888888 | 0 |
| 0.7645833333333334 | 0 |
| 0.7652777777777778 | 0 |
| 0.7659722222222222 | 0 |
| 0.7666666666666666 | 0 |
| 0.7673611111111112 | 0 |
| 0.7680555555555556 | 0 |
| 0.7687499999999999 | 0 |
| 0.7694444444444444 | 0 |
| 0.7701388888888889 | 0 |
| 0.7708333333333334 | 0 |
| 0.7715277777777777 | 0 |
| 0.7722222222222223 | 0 |
| 0.7729166666666667 | 0 |
| 0.7736111111111111 | 0 |
| 0.7743055555555555 | 0 |
| 0.775 | 0 |
| 0.7756944444444445 | 0 |
| 0.7763888888888889 | 0 |
| 0.7770833333333332 | 0 |
| 0.7777777777777778 | 0 |
| 0.7784722222222222 | 0 |
| 0.7791666666666667 | 0 |
| 0.779861111111111 | 0 |
| 0.7805555555555556 | 0 |
| 0.78125 | 0 |
| 0.7819444444444444 | 0 |
| 0.782638888888889 | 0 |
| 0.7833333333333333 | 0 |
| 0.7840277777777778 | 0 |
| 0.7847222222222222 | 0 |
| 0.7854166666666668 | 0 |
| 0.7861111111111111 | 0 |
| 0.7868055555555555 | 0 |
| 0.7875 | 0 |
| 0.7881944444444445 | 0 |
| 0.7888888888888889 | 0 |
| 0.7895833333333333 | 0 |
| 0.7902777777777777 | 0 |
| 0.7909722222222223 | 0 |
| 0.7916666666666666 | 0 |
| 0.7923611111111111 | 0 |
| 0.7930555555555556 | 0 |
| 0.7937500000000001 | 0 |
| 0.7944444444444444 | 0 |
| 0.7951388888888888 | 0 |
| 0.7958333333333334 | 0 |
| 0.7965277777777778 | 0 |
| 0.7972222222222222 | 0 |
| 0.7979166666666666 | 0 |
| 0.7986111111111112 | 0 |
| 0.7993055555555556 | 0 |
| 0.7999999999999999 | 0 |
| 0.8006944444444444 | 0 |
| 0.8013888888888889 | 0 |
| 0.8020833333333334 | 0 |
| 0.8027777777777777 | 0 |
| 0.8034722222222223 | 0 |
| 0.8041666666666667 | 0 |
| 0.8048611111111111 | 0 |
| 0.8055555555555555 | 0 |
| 0.80625 | 0 |
| 0.8069444444444445 | 0 |
| 0.8076388888888889 | 0 |
| 0.8083333333333332 | 0 |
| 0.8090277777777778 | 0 |
| 0.8097222222222222 | 0 |
| 0.8104166666666667 | 0 |
| 0.811111111111111 | 0 |
| 0.8118055555555556 | 0 |
| 0.8125 | 0 |
| 0.8131944444444444 | 0 |
| 0.813888888888889 | 0 |
| 0.8145833333333333 | 0 |
| 0.8152777777777778 | 0 |
| 0.8159722222222222 | 0 |
| 0.8166666666666668 | 0 |
| 0.8173611111111111 | 0 |
| 0.8180555555555555 | 0 |
| 0.81875 | 0 |
| 0.8194444444444445 | 0 |
| 0.8201388888888889 | 0 |
| 0.8208333333333333 | 0 |
| 0.8215277777777777 | 0 |
| 0.8222222222222223 | 0 |
| 0.8229166666666666 | 0 |
| 0.8236111111111111 | 0 |
| 0.8243055555555556 | 0 |
| 0.8250000000000001 | 0 |
| 0.8256944444444444 | 0 |
| 0.8263888888888888 | 0 |
| 0.8270833333333334 | 0 |
| 0.8277777777777778 | 0 |
| 0.8284722222222222 | 0 |
| 0.8291666666666666 | 0 |
| 0.8298611111111112 | 0 |
| 0.8305555555555556 | 0 |
| 0.8312499999999999 | 0 |
| 0.8319444444444444 | 0 |
| 0.8326388888888889 | 0 |
| 0.8333333333333334 | 0 |
| 0.8340277777777777 | 0 |
| 0.8347222222222223 | 0 |
| 0.8354166666666667 | 0 |
| 0.8361111111111111 | 0 |
| 0.8368055555555555 | 0 |
| 0.8375 | 0 |
| 0.8381944444444445 | 0 |
| 0.8388888888888889 | 0 |
| 0.8395833333333332 | 0 |
| 0.8402777777777778 | 0 |
| 0.8409722222222222 | 0 |
| 0.8416666666666667 | 0 |
| 0.842361111111111 | 0 |
| 0.8430555555555556 | 0 |
| 0.84375 | 0 |
| 0.8444444444444444 | 0 |
| 0.845138888888889 | 0 |
| 0.8458333333333333 | 0 |
| 0.8465277777777778 | 0 |
| 0.8472222222222222 | 0 |
| 0.8479166666666668 | 0 |
| 0.8486111111111111 | 0 |
| 0.8493055555555555 | 0 |
| 0.85 | 0 |
| 0.8506944444444445 | 0 |
| 0.8513888888888889 | 0 |
| 0.8520833333333333 | 0 |
| 0.8527777777777777 | 0 |
| 0.8534722222222223 | 0 |
| 0.8541666666666666 | 0 |
| 0.8548611111111111 | 0 |
| 0.8555555555555556 | 0 |
| 0.8562500000000001 | 0 |
| 0.8569444444444444 | 0 |
| 0.8576388888888888 | 0 |
| 0.8583333333333334 | 0 |
| 0.8590277777777778 | 0 |
| 0.8597222222222222 | 0 |
| 0.8604166666666666 | 0 |
| 0.8611111111111112 | 0 |
| 0.8618055555555556 | 0 |
| 0.8624999999999999 | 0 |
| 0.8631944444444444 | 0 |
| 0.8638888888888889 | 0 |
| 0.8645833333333334 | 0 |
| 0.8652777777777777 | 0 |
| 0.8659722222222223 | 0 |
| 0.8666666666666667 | 0 |
| 0.8673611111111111 | 0 |
| 0.8680555555555555 | 0 |
| 0.86875 | 0 |
| 0.8694444444444445 | 0 |
| 0.8701388888888889 | 0 |
| 0.8708333333333332 | 0 |
| 0.8715277777777778 | 0 |
| 0.8722222222222222 | 0 |
| 0.8729166666666667 | 0 |
| 0.873611111111111 | 0 |
| 0.8743055555555556 | 0 |
| 0.875 | 0 |
| 0.8756944444444444 | 0 |
| 0.876388888888889 | 0 |
| 0.8770833333333333 | 0 |
| 0.8777777777777778 | 0 |
| 0.8784722222222222 | 0 |
| 0.8791666666666668 | 0 |
| 0.8798611111111111 | 0 |
| 0.8805555555555555 | 0 |
| 0.88125 | 0 |
| 0.8819444444444445 | 0 |
| 0.8826388888888889 | 0 |
| 0.8833333333333333 | 0 |
| 0.8840277777777777 | 0 |
| 0.8847222222222223 | 0 |
| 0.8854166666666666 | 0 |
| 0.8861111111111111 | 0 |
| 0.8868055555555556 | 0 |
| 0.8875000000000001 | 0 |
| 0.8881944444444444 | 0 |
| 0.8888888888888888 | 0 |
| 0.8895833333333334 | 0 |
| 0.8902777777777778 | 0 |
| 0.8909722222222222 | 0 |
| 0.8916666666666666 | 0 |
| 0.8923611111111112 | 0 |
| 0.8930555555555556 | 0 |
| 0.8937499999999999 | 0 |
| 0.8944444444444444 | 0 |
| 0.8951388888888889 | 0 |
| 0.8958333333333334 | 0 |
| 0.8965277777777777 | 0 |
| 0.8972222222222223 | 0 |
| 0.8979166666666667 | 0 |
| 0.8986111111111111 | 0 |
| 0.8993055555555555 | 0 |
| 0.9 | 0 |
| 0.9006944444444445 | 0 |
| 0.9013888888888889 | 0 |
| 0.9020833333333332 | 0 |
| 0.9027777777777778 | 0 |
| 0.9034722222222222 | 0 |
| 0.9041666666666667 | 0 |
| 0.904861111111111 | 0 |
| 0.9055555555555556 | 0 |
| 0.90625 | 0 |
| 0.9069444444444444 | 0 |
| 0.907638888888889 | 0 |
| 0.9083333333333333 | 0 |
| 0.9090277777777778 | 0 |
| 0.9097222222222222 | 0 |
| 0.9104166666666668 | 0 |
| 0.9111111111111111 | 0 |
| 0.9118055555555555 | 0 |
| 0.9125 | 0 |
| 0.9131944444444445 | 0 |
| 0.9138888888888889 | 0 |
| 0.9145833333333333 | 0 |
| 0.9152777777777777 | 0 |
| 0.9159722222222223 | 0 |
| 0.9166666666666666 | 0 |
| 0.9173611111111111 | 0 |
| 0.9180555555555556 | 0 |
| 0.9187500000000001 | 0 |
| 0.9194444444444444 | 0 |
| 0.9201388888888888 | 0 |
| 0.9208333333333334 | 0 |
| 0.9215277777777778 | 0 |
| 0.9222222222222222 | 0 |
| 0.9229166666666666 | 0 |
| 0.9236111111111112 | 0 |
| 0.9243055555555556 | 0 |
| 0.9249999999999999 | 0 |
| 0.9256944444444444 | 0 |
| 0.9263888888888889 | 0 |
| 0.9270833333333334 | 0 |
| 0.9277777777777777 | 0 |
| 0.9284722222222223 | 0 |
| 0.9291666666666667 | 0 |
| 0.9298611111111111 | 0 |
| 0.9305555555555555 | 0 |
| 0.93125 | 0 |
| 0.9319444444444445 | 0 |
| 0.9326388888888889 | 0 |
| 0.9333333333333332 | 0 |
| 0.9340277777777778 | 0 |
| 0.9347222222222222 | 0 |
| 0.9354166666666667 | 0 |
| 0.936111111111111 | 0 |
| 0.9368055555555556 | 0 |
| 0.9375 | 0 |
| 0.9381944444444444 | 0 |
| 0.938888888888889 | 0 |
| 0.9395833333333333 | 0 |
| 0.9402777777777778 | 0 |
| 0.9409722222222222 | 0 |
| 0.9416666666666668 | 0 |
| 0.9423611111111111 | 0 |
| 0.9430555555555555 | 0 |
| 0.94375 | 0 |
| 0.9444444444444445 | 0 |
| 0.9451388888888889 | 0 |
| 0.9458333333333333 | 0 |
| 0.9465277777777777 | 0 |
| 0.9472222222222223 | 0 |
| 0.9479166666666666 | 0 |
| 0.9486111111111111 | 0 |
| 0.9493055555555556 | 0 |
| 0.9500000000000001 | 0 |
| 0.9506944444444444 | 0 |
| 0.9513888888888888 | 0 |
| 0.9520833333333334 | 0 |
| 0.9527777777777778 | 0 |
| 0.9534722222222222 | 0 |
| 0.9541666666666666 | 0 |
| 0.9548611111111112 | 0 |
| 0.9555555555555556 | 0 |
| 0.9562499999999999 | 0 |
| 0.9569444444444444 | 0 |
| 0.9576388888888889 | 0 |
| 0.9583333333333334 | 0 |
| 0.9590277777777777 | 0 |
| 0.9597222222222223 | 0 |
| 0.9604166666666667 | 0 |
| 0.9611111111111111 | 0 |
| 0.9618055555555555 | 0 |
| 0.9625 | 0 |
| 0.9631944444444445 | 0 |
| 0.9638888888888889 | 0 |
| 0.9645833333333332 | 0 |
| 0.9652777777777778 | 0 |
| 0.9659722222222222 | 0 |
| 0.9666666666666667 | 0 |
| 0.967361111111111 | 0 |
| 0.9680555555555556 | 0 |
| 0.96875 | 0 |
| 0.9694444444444444 | 0 |
| 0.970138888888889 | 0 |
| 0.9708333333333333 | 0 |
| 0.9715277777777778 | 0 |
| 0.9722222222222222 | 0 |
| 0.9729166666666668 | 0 |
| 0.9736111111111111 | 0 |
| 0.9743055555555555 | 0 |
| 0.975 | 0 |
| 0.9756944444444445 | 0 |
| 0.9763888888888889 | 0 |
| 0.9770833333333333 | 0 |
| 0.9777777777777777 | 0 |
| 0.9784722222222223 | 0 |
| 0.9791666666666666 | 0 |
| 0.9798611111111111 | 0 |
| 0.9805555555555556 | 0 |
| 0.9812500000000001 | 0 |
| 0.9819444444444444 | 0 |
| 0.9826388888888888 | 0 |
| 0.9833333333333334 | 0 |
| 0.9840277777777778 | 0 |
| 0.9847222222222222 | 0 |
| 0.9854166666666666 | 0 |
| 0.9861111111111112 | 0 |
| 0.9868055555555556 | 0 |
| 0.9874999999999999 | 0 |
| 0.9881944444444444 | 0 |
| 0.9888888888888889 | 0 |
| 0.9895833333333334 | 0 |
| 0.9902777777777777 | 0 |
| 0.9909722222222223 | 0 |
| 0.9916666666666667 | 0 |
| 0.9923611111111111 | 0 |
| 0.9930555555555555 | 0 |
| 0.99375 | 0 |
| 0.9944444444444445 | 0 |
| 0.9951388888888889 | 0 |
| 0.9958333333333332 | 0 |
| 0.9965277777777778 | 0 |
| 0.9972222222222222 | 0 |
| 0.9979166666666667 | 0 |
| 0.998611111111111 | 0 |
| 0.9993055555555556 | 0 |